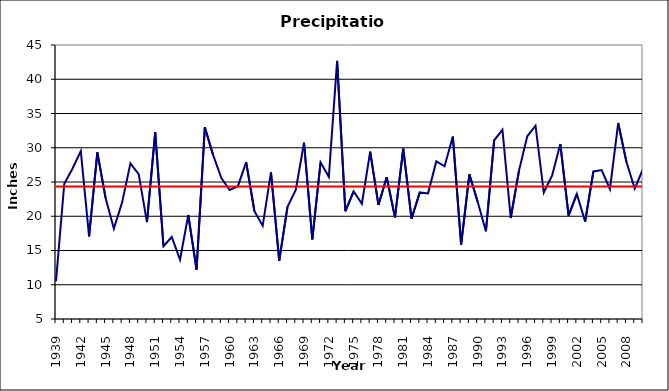
| Category | Annual Precipitation | Average Precipitation |
|---|---|---|
| 1939.0 | 10.51 | 24.33 |
| 1940.0 | 24.74 | 24.33 |
| 1941.0 | 26.98 | 24.33 |
| 1942.0 | 29.5 | 24.33 |
| 1943.0 | 17.05 | 24.33 |
| 1944.0 | 29.33 | 24.33 |
| 1945.0 | 22.66 | 24.33 |
| 1946.0 | 18.19 | 24.33 |
| 1947.0 | 22.03 | 24.33 |
| 1948.0 | 27.73 | 24.33 |
| 1949.0 | 26.155 | 24.33 |
| 1950.0 | 19.153 | 24.33 |
| 1951.0 | 32.235 | 24.33 |
| 1952.0 | 15.625 | 24.33 |
| 1953.0 | 16.97 | 24.33 |
| 1954.0 | 13.658 | 24.33 |
| 1955.0 | 20.182 | 24.33 |
| 1956.0 | 12.212 | 24.33 |
| 1957.0 | 32.987 | 24.33 |
| 1958.0 | 28.947 | 24.33 |
| 1959.0 | 25.585 | 24.33 |
| 1960.0 | 23.828 | 24.33 |
| 1961.0 | 24.388 | 24.33 |
| 1962.0 | 27.902 | 24.33 |
| 1963.0 | 20.73 | 24.33 |
| 1964.0 | 18.603 | 24.33 |
| 1965.0 | 26.417 | 24.33 |
| 1966.0 | 13.518 | 24.33 |
| 1967.0 | 21.375 | 24.33 |
| 1968.0 | 23.828 | 24.33 |
| 1969.0 | 30.732 | 24.33 |
| 1970.0 | 16.62 | 24.33 |
| 1971.0 | 27.875 | 24.33 |
| 1972.0 | 25.763 | 24.33 |
| 1973.0 | 42.685 | 24.33 |
| 1974.0 | 20.738 | 24.33 |
| 1975.0 | 23.63 | 24.33 |
| 1976.0 | 21.828 | 24.33 |
| 1977.0 | 29.43 | 24.33 |
| 1978.0 | 21.65 | 24.33 |
| 1979.0 | 25.697 | 24.33 |
| 1980.0 | 19.84 | 24.33 |
| 1981.0 | 29.873 | 24.33 |
| 1982.0 | 19.638 | 24.33 |
| 1983.0 | 23.473 | 24.33 |
| 1984.0 | 23.34 | 24.33 |
| 1985.0 | 28.008 | 24.33 |
| 1986.0 | 27.3 | 24.33 |
| 1987.0 | 31.627 | 24.33 |
| 1988.0 | 15.847 | 24.33 |
| 1989.0 | 26.115 | 24.33 |
| 1990.0 | 22.105 | 24.33 |
| 1991.0 | 17.815 | 24.33 |
| 1992.0 | 31.093 | 24.33 |
| 1993.0 | 32.623 | 24.33 |
| 1994.0 | 19.74 | 24.33 |
| 1995.0 | 26.662 | 24.33 |
| 1996.0 | 31.672 | 24.33 |
| 1997.0 | 33.215 | 24.33 |
| 1998.0 | 23.46 | 24.33 |
| 1999.0 | 25.913 | 24.33 |
| 2000.0 | 30.532 | 24.33 |
| 2001.0 | 20.105 | 24.33 |
| 2002.0 | 23.255 | 24.33 |
| 2003.0 | 19.223 | 24.33 |
| 2004.0 | 26.54 | 24.33 |
| 2005.0 | 26.742 | 24.33 |
| 2006.0 | 23.943 | 24.33 |
| 2007.0 | 33.603 | 24.33 |
| 2008.0 | 27.903 | 24.33 |
| 2009.0 | 24.048 | 24.33 |
| 2010.0 | 26.89 | 24.33 |